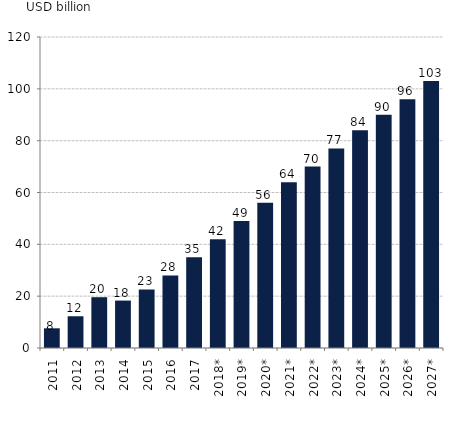
| Category | Big data piac bevétele (mrd USD) |
|---|---|
| 2011 | 7.6 |
| 2012 | 12.25 |
| 2013 | 19.6 |
| 2014 | 18.3 |
| 2015 | 22.6 |
| 2016 | 28 |
| 2017 | 35 |
| 2018* | 42 |
| 2019* | 49 |
| 2020* | 56 |
| 2021* | 64 |
| 2022* | 70 |
| 2023* | 77 |
| 2024* | 84 |
| 2025* | 90 |
| 2026* | 96 |
| 2027* | 103 |